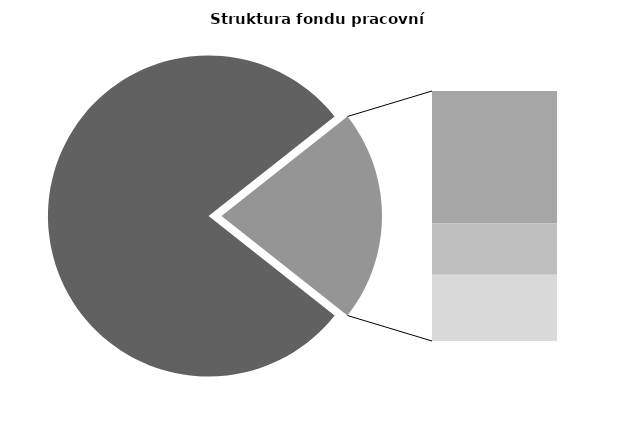
| Category | Series 0 |
|---|---|
| Průměrná měsíční odpracovaná doba bez přesčasu | 135.7 |
| Dovolená | 19.436 |
| Nemoc | 7.507 |
| Jiné | 9.725 |